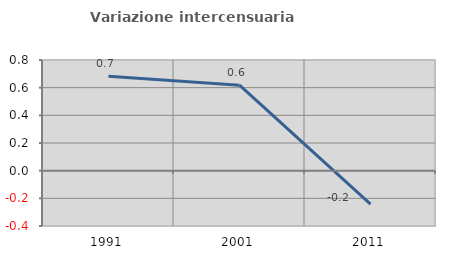
| Category | Variazione intercensuaria annua |
|---|---|
| 1991.0 | 0.682 |
| 2001.0 | 0.618 |
| 2011.0 | -0.242 |